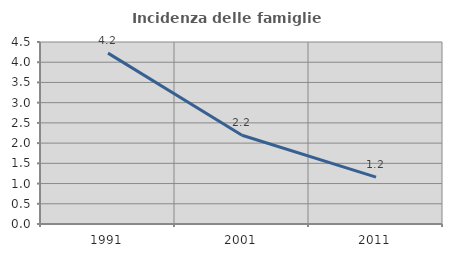
| Category | Incidenza delle famiglie numerose |
|---|---|
| 1991.0 | 4.225 |
| 2001.0 | 2.196 |
| 2011.0 | 1.161 |